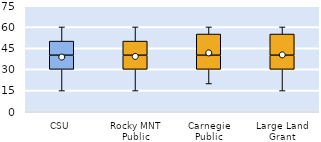
| Category | 25th | 50th | 75th |
|---|---|---|---|
| CSU | 30 | 10 | 10 |
| Rocky MNT Public | 30 | 10 | 10 |
| Carnegie Public | 30 | 10 | 15 |
| Large Land Grant | 30 | 10 | 15 |